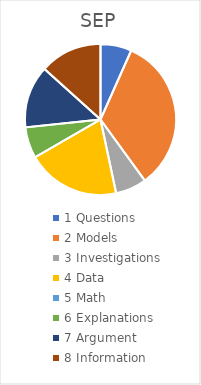
| Category | SEP |
|---|---|
| 1 Questions | 0.067 |
| 2 Models | 0.333 |
| 3 Investigations | 0.067 |
| 4 Data | 0.2 |
| 5 Math | 0 |
| 6 Explanations | 0.067 |
| 7 Argument | 0.133 |
| 8 Information | 0.133 |